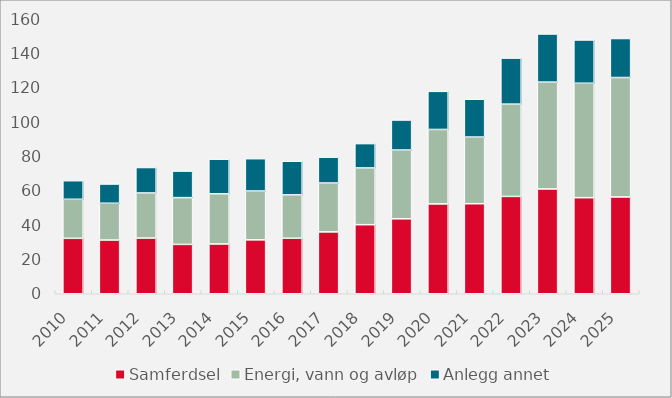
| Category | Samferdsel | Energi, vann og avløp | Anlegg annet |
|---|---|---|---|
| 2010.0 | 32.254 | 22.702 | 10.824 |
| 2011.0 | 31.255 | 21.405 | 11.19 |
| 2012.0 | 32.403 | 26.24 | 14.8 |
| 2013.0 | 28.712 | 27.224 | 15.44 |
| 2014.0 | 28.959 | 29.188 | 20.155 |
| 2015.0 | 31.362 | 28.403 | 18.824 |
| 2016.0 | 32.307 | 25.223 | 19.578 |
| 2017.0 | 35.995 | 28.441 | 15.042 |
| 2018.0 | 40.187 | 33.008 | 14.177 |
| 2019.0 | 43.613 | 40.014 | 17.461 |
| 2020.0 | 52.289 | 43.299 | 22.182 |
| 2021.0 | 52.389 | 38.78 | 21.987 |
| 2022.0 | 56.631 | 53.705 | 26.77 |
| 2023.0 | 60.979 | 62.165 | 28.009 |
| 2024.0 | 55.896 | 66.579 | 25.171 |
| 2025.0 | 56.323 | 69.48 | 22.704 |